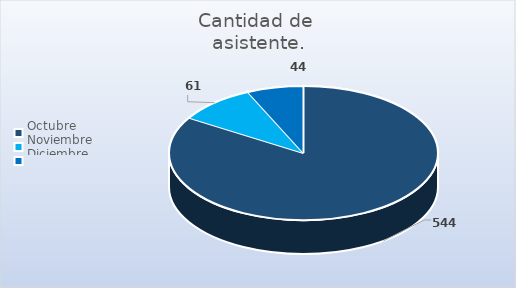
| Category | Cantidad de 
asistente. |
|---|---|
| Octubre | 544 |
| Noviembre | 61 |
| Diciembre | 44 |